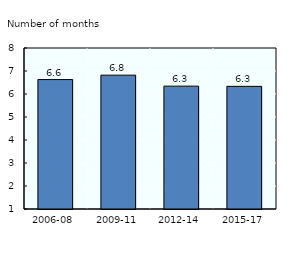
| Category | Series 0 |
|---|---|
| 2006-08 | 6.628 |
| 2009-11 | 6.819 |
| 2012-14 | 6.342 |
| 2015-17 | 6.333 |